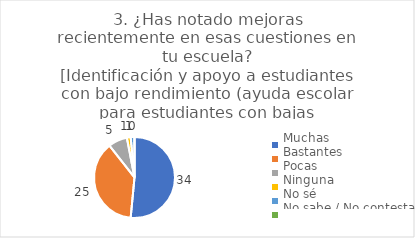
| Category | 3. ¿Has notado mejoras recientemente en esas cuestiones en tu escuela?
[Identificación y apoyo a estudiantes con bajo rendimiento (ayuda escolar para estudiantes con bajas calificaciones)] |
|---|---|
| Muchas  | 0.515 |
| Bastantes  | 0.379 |
| Pocas  | 0.076 |
| Ninguna  | 0.015 |
| No sé  | 0.015 |
| No sabe / No contesta | 0 |